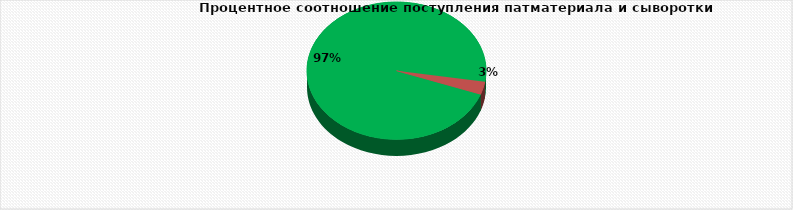
| Category |  методом ПЦР |
|---|---|
| 2076.0 | 2076 |